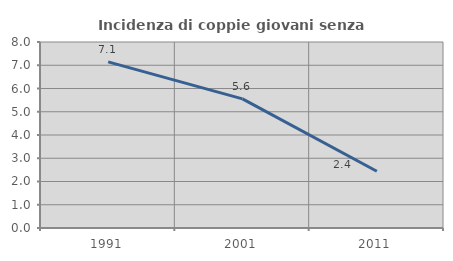
| Category | Incidenza di coppie giovani senza figli |
|---|---|
| 1991.0 | 7.143 |
| 2001.0 | 5.556 |
| 2011.0 | 2.439 |